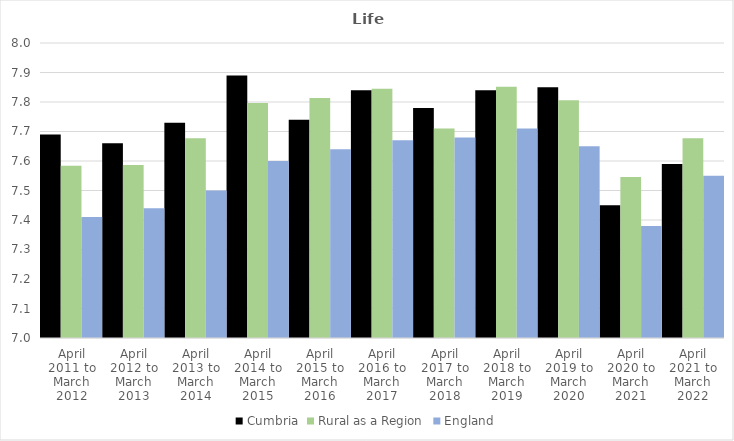
| Category | Cumbria | Rural as a Region | England |
|---|---|---|---|
| April 2011 to March 2012 | 7.69 | 7.584 | 7.41 |
| April 2012 to March 2013 | 7.66 | 7.586 | 7.44 |
| April 2013 to March 2014 | 7.73 | 7.677 | 7.5 |
| April 2014 to March 2015 | 7.89 | 7.797 | 7.6 |
| April 2015 to March 2016 | 7.74 | 7.813 | 7.64 |
| April 2016 to March 2017 | 7.84 | 7.845 | 7.67 |
| April 2017 to March 2018 | 7.78 | 7.71 | 7.68 |
| April 2018 to March 2019 | 7.84 | 7.852 | 7.71 |
| April 2019 to March 2020 | 7.85 | 7.806 | 7.65 |
| April 2020 to March 2021 | 7.45 | 7.546 | 7.38 |
| April 2021 to March 2022 | 7.59 | 7.677 | 7.55 |